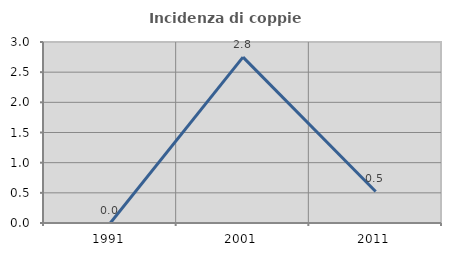
| Category | Incidenza di coppie miste |
|---|---|
| 1991.0 | 0 |
| 2001.0 | 2.75 |
| 2011.0 | 0.522 |